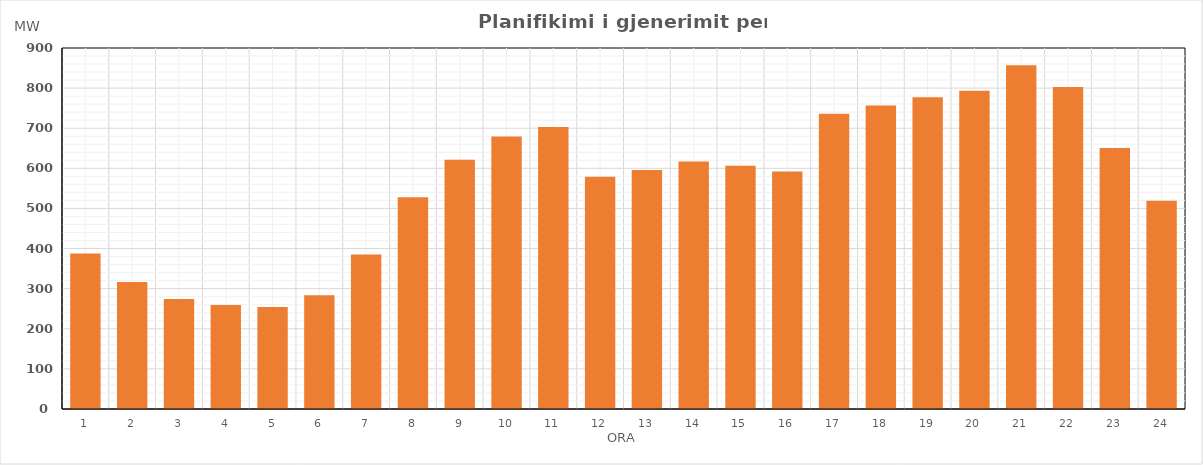
| Category | Max (MW) |
|---|---|
| 0 | 387.47 |
| 1 | 316.63 |
| 2 | 274.12 |
| 3 | 259.44 |
| 4 | 254.6 |
| 5 | 283.89 |
| 6 | 385.01 |
| 7 | 528.07 |
| 8 | 621.65 |
| 9 | 679.09 |
| 10 | 703.16 |
| 11 | 579.16 |
| 12 | 595.6 |
| 13 | 617.28 |
| 14 | 606.41 |
| 15 | 592.27 |
| 16 | 736.15 |
| 17 | 756.9 |
| 18 | 777.49 |
| 19 | 793.6 |
| 20 | 856.75 |
| 21 | 803.05 |
| 22 | 650.6 |
| 23 | 519.25 |